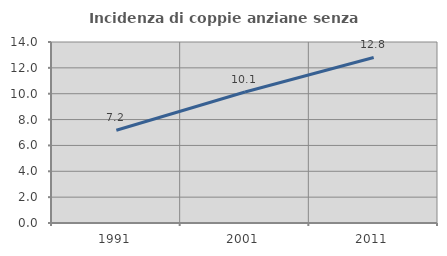
| Category | Incidenza di coppie anziane senza figli  |
|---|---|
| 1991.0 | 7.172 |
| 2001.0 | 10.135 |
| 2011.0 | 12.802 |